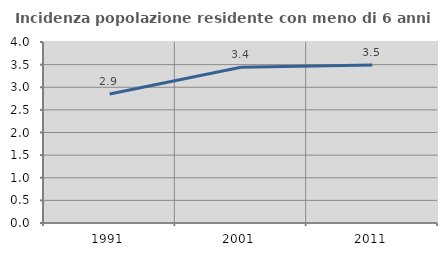
| Category | Incidenza popolazione residente con meno di 6 anni |
|---|---|
| 1991.0 | 2.852 |
| 2001.0 | 3.442 |
| 2011.0 | 3.494 |